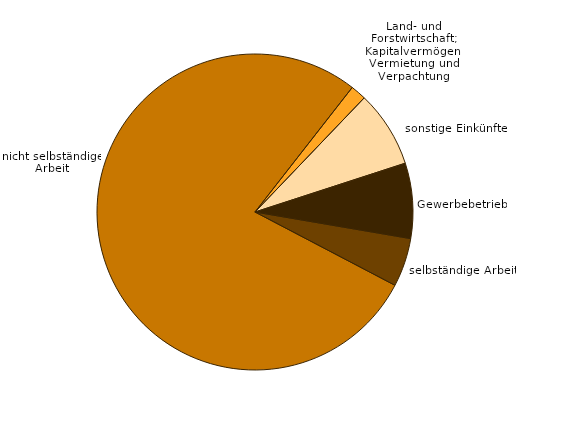
| Category | Einkünfte |
|---|---|
| Gewerbebetrieb | 3508706 |
| selbständige Arbeit | 2269995 |
| nicht selbständige Arbeit | 35488728 |
| Land- und Forstwirtschaft; Kapitalvermögen; Vermietung und Verpachtung | 728736 |
| sonstige Einkünfte | 3578539 |